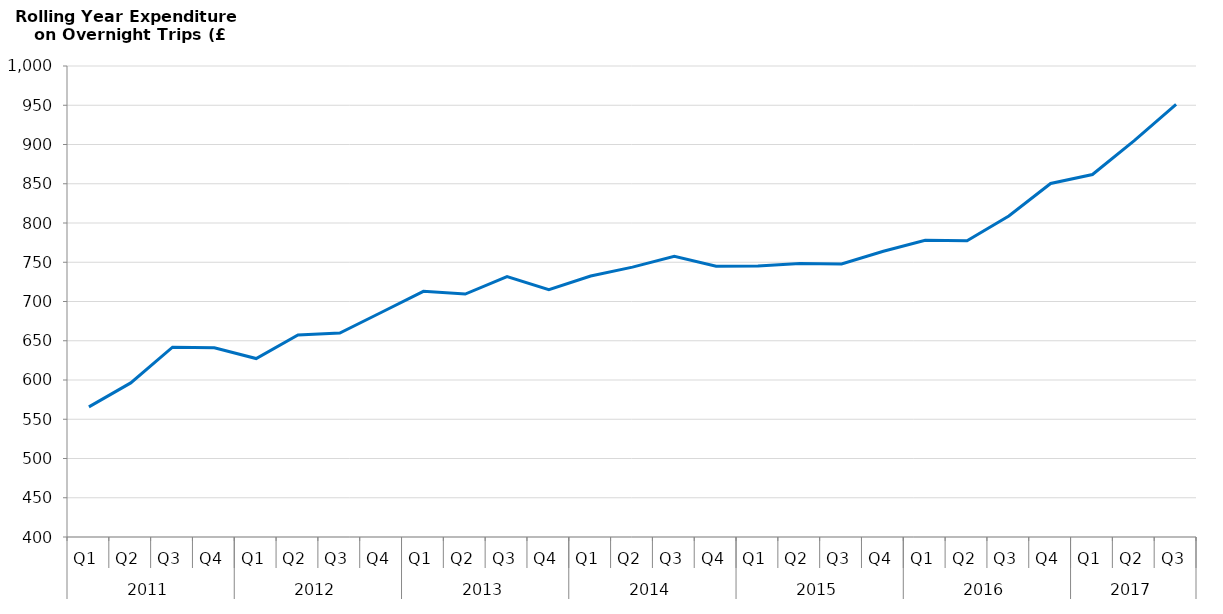
| Category | Rolling Year Expenditure during Overnight Trips (£) |
|---|---|
| 0 | 565729554.001 |
| 1 | 596312192.593 |
| 2 | 641866557.5 |
| 3 | 641047679.387 |
| 4 | 627323887.721 |
| 5 | 657242377.112 |
| 6 | 659852225.798 |
| 7 | 686321849.941 |
| 8 | 712983579.382 |
| 9 | 709441918.473 |
| 10 | 731788868.702 |
| 11 | 715190933.753 |
| 12 | 732440715.999 |
| 13 | 743830056.838 |
| 14 | 757659736.92 |
| 15 | 744902295.731 |
| 16 | 745261550.624 |
| 17 | 748317146.573 |
| 18 | 747907058.216 |
| 19 | 764066271.956 |
| 20 | 777939680.598 |
| 21 | 777438191.634 |
| 22 | 808977024.09 |
| 23 | 850358144.473 |
| 24 | 861792833.678 |
| 25 | 904892580.337 |
| 26 | 950991751.166 |